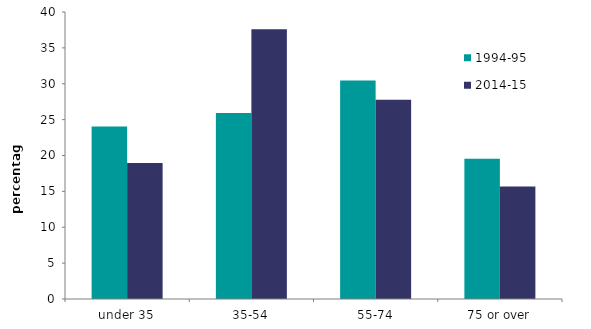
| Category | 1994-95 | 2014-15 |
|---|---|---|
| under 35 | 24.053 | 18.957 |
| 35-54 | 25.923 | 37.602 |
| 55-74 | 30.462 | 27.774 |
| 75 or over | 19.561 | 15.666 |